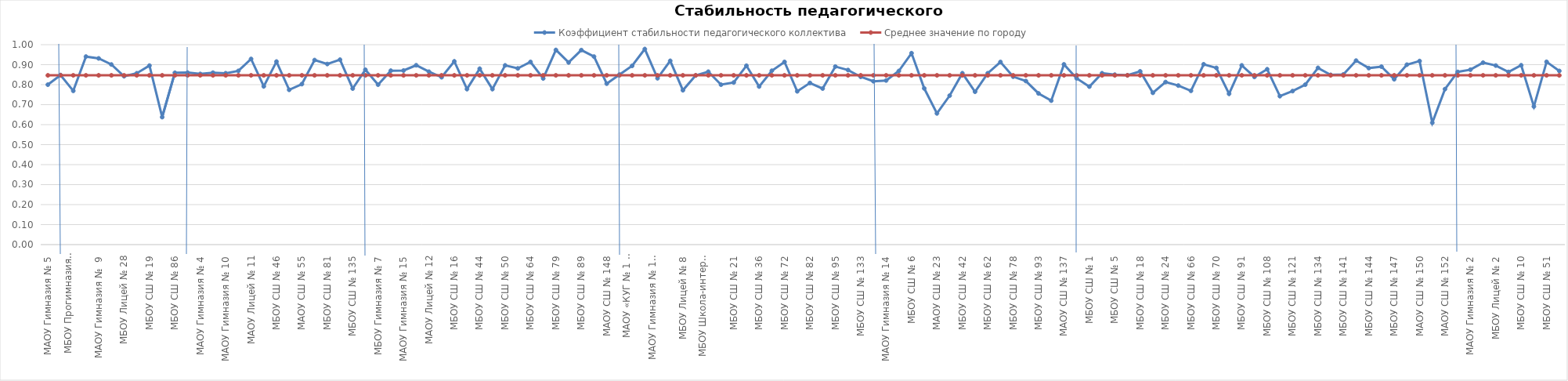
| Category | Коэффициент стабильности педагогического коллектива | Среднее значение по городу |
|---|---|---|
| МАОУ Гимназия № 5 | 0.8 | 0.847 |
| ЖЕЛЕЗНОДОРОЖНЫЙ РАЙОН | 0.848 | 0.847 |
| МБОУ Прогимназия  № 131 | 0.769 | 0.847 |
| МБОУ Гимназия № 8 | 0.94 | 0.847 |
| МАОУ Гимназия №  9 | 0.931 | 0.847 |
| МАОУ Лицей № 7 | 0.901 | 0.847 |
| МБОУ Лицей № 28 | 0.842 | 0.847 |
| МБОУ СШ  № 12 | 0.857 | 0.847 |
| МБОУ СШ № 19 | 0.895 | 0.847 |
| МАОУ СШ № 32 | 0.638 | 0.847 |
| МБОУ СШ № 86 | 0.86 | 0.847 |
| КИРОВСКИЙ РАЙОН | 0.86 | 0.847 |
| МАОУ Гимназия № 4 | 0.854 | 0.847 |
| МАОУ Гимназия № 6 | 0.86 | 0.847 |
| МАОУ Гимназия № 10 | 0.857 | 0.847 |
| МАОУ Лицей № 6 "Перспектива" | 0.869 | 0.847 |
| МАОУ Лицей № 11 | 0.929 | 0.847 |
| МБОУ СШ № 8 "Созидание" | 0.792 | 0.847 |
| МБОУ СШ № 46 | 0.915 | 0.847 |
| МБОУ СШ № 49 | 0.774 | 0.847 |
| МАОУ СШ № 55 | 0.803 | 0.847 |
| МБОУ СШ № 63 | 0.923 | 0.847 |
| МБОУ СШ № 81 | 0.903 | 0.847 |
| МБОУ СШ № 90 | 0.925 | 0.847 |
| МБОУ СШ № 135 | 0.78 | 0.847 |
| ЛЕНИНСКИЙ РАЙОН | 0.875 | 0.847 |
| МБОУ Гимназия № 7 | 0.8 | 0.847 |
| МАОУ Гимназия № 11 | 0.87 | 0.847 |
| МАОУ Гимназия № 15 | 0.871 | 0.847 |
| МБОУ Лицей № 3 | 0.897 | 0.847 |
| МАОУ Лицей № 12 | 0.865 | 0.847 |
| МБОУ СШ № 13 | 0.837 | 0.847 |
| МБОУ СШ № 16 | 0.917 | 0.847 |
| МБОУ СШ № 31 | 0.778 | 0.847 |
| МБОУ СШ № 44 | 0.88 | 0.847 |
| МБОУ СШ № 47 | 0.778 | 0.847 |
| МБОУ СШ № 50 | 0.897 | 0.847 |
| МБОУ СШ № 53 | 0.881 | 0.847 |
| МБОУ СШ № 64 | 0.914 | 0.847 |
| МБОУ СШ № 65 | 0.831 | 0.847 |
| МБОУ СШ № 79 | 0.974 | 0.847 |
| МБОУ СШ № 88 | 0.911 | 0.847 |
| МБОУ СШ № 89 | 0.973 | 0.847 |
| МБОУ СШ № 94 | 0.94 | 0.847 |
| МАОУ СШ № 148 | 0.805 | 0.847 |
| ОКТЯБРЬСКИЙ РАЙОН | 0.85 | 0.847 |
| МАОУ «КУГ № 1 – Универс» | 0.894 | 0.847 |
| МАОУ Гимназия № 3 | 0.978 | 0.847 |
| МАОУ Гимназия № 13 "Академ" | 0.832 | 0.847 |
| МАОУ Лицей № 1 | 0.919 | 0.847 |
| МБОУ Лицей № 8 | 0.772 | 0.847 |
| МБОУ Лицей № 10 | 0.846 | 0.847 |
| МБОУ Школа-интернат № 1 | 0.865 | 0.847 |
| МБОУ СШ № 3 | 0.8 | 0.847 |
| МБОУ СШ № 21 | 0.811 | 0.847 |
| МБОУ СШ № 30 | 0.895 | 0.847 |
| МБОУ СШ № 36 | 0.791 | 0.847 |
| МБОУ СШ № 39 | 0.87 | 0.847 |
| МБОУ СШ № 72 | 0.914 | 0.847 |
| МБОУ СШ № 73 | 0.767 | 0.847 |
| МБОУ СШ № 82 | 0.809 | 0.847 |
| МБОУ СШ № 84 | 0.78 | 0.847 |
| МБОУ СШ № 95 | 0.891 | 0.847 |
| МБОУ СШ № 99 | 0.873 | 0.847 |
| МБОУ СШ № 133 | 0.839 | 0.847 |
| СВЕРДЛОВСКИЙ РАЙОН | 0.817 | 0.847 |
| МАОУ Гимназия № 14 | 0.821 | 0.847 |
| МАОУ Лицей № 9 "Лидер" | 0.868 | 0.847 |
| МБОУ СШ № 6 | 0.957 | 0.847 |
| МБОУ СШ № 17 | 0.781 | 0.847 |
| МАОУ СШ № 23 | 0.656 | 0.847 |
| МБОУ СШ № 34 | 0.745 | 0.847 |
| МБОУ СШ № 42 | 0.857 | 0.847 |
| МБОУ СШ № 45 | 0.765 | 0.847 |
| МБОУ СШ № 62 | 0.857 | 0.847 |
| МБОУ СШ № 76 | 0.914 | 0.847 |
| МБОУ СШ № 78 | 0.84 | 0.847 |
| МБОУ СШ № 92 | 0.818 | 0.847 |
| МБОУ СШ № 93 | 0.756 | 0.847 |
| МБОУ СШ № 97 | 0.72 | 0.847 |
| МАОУ СШ № 137 | 0.901 | 0.847 |
| СОВЕТСКИЙ РАЙОН | 0.832 | 0.847 |
| МБОУ СШ № 1 | 0.79 | 0.847 |
| МБОУ СШ № 2 | 0.857 | 0.847 |
| МБОУ СШ № 5 | 0.85 | 0.847 |
| МБОУ СШ № 7 | 0.847 | 0.847 |
| МБОУ СШ № 18 | 0.867 | 0.847 |
| МАОУ СШ № 22 | 0.759 | 0.847 |
| МБОУ СШ № 24 | 0.813 | 0.847 |
| МБОУ СШ № 56 | 0.795 | 0.847 |
| МБОУ СШ № 66 | 0.769 | 0.847 |
| МБОУ СШ № 69 | 0.902 | 0.847 |
| МБОУ СШ № 70 | 0.884 | 0.847 |
| МБОУ СШ № 85 | 0.754 | 0.847 |
| МБОУ СШ № 91 | 0.897 | 0.847 |
| МБОУ СШ № 98 | 0.839 | 0.847 |
| МБОУ СШ № 108 | 0.877 | 0.847 |
| МБОУ СШ № 115 | 0.742 | 0.847 |
| МБОУ СШ № 121 | 0.768 | 0.847 |
| МБОУ СШ № 129 | 0.8 | 0.847 |
| МБОУ СШ № 134 | 0.884 | 0.847 |
| МБОУ СШ № 139 | 0.849 | 0.847 |
| МБОУ СШ № 141 | 0.851 | 0.847 |
| МАОУ СШ № 143 | 0.92 | 0.847 |
| МБОУ СШ № 144 | 0.883 | 0.847 |
| МАОУ СШ № 145 | 0.89 | 0.847 |
| МБОУ СШ № 147 | 0.827 | 0.847 |
| МАОУ СШ № 149 | 0.9 | 0.847 |
| МАОУ СШ № 150 | 0.918 | 0.847 |
| МАОУ СШ № 151 | 0.609 | 0.847 |
| МАОУ СШ № 152 | 0.778 | 0.847 |
| ЦЕНТРАЛЬНЫЙ РАЙОН | 0.864 | 0.847 |
| МАОУ Гимназия № 2 | 0.875 | 0.847 |
| МБОУ  Гимназия № 16 | 0.91 | 0.847 |
| МБОУ Лицей № 2 | 0.896 | 0.847 |
| МБОУ СШ № 4 | 0.864 | 0.847 |
| МБОУ СШ № 10 | 0.897 | 0.847 |
| МБОУ СШ № 27 | 0.691 | 0.847 |
| МБОУ СШ № 51 | 0.914 | 0.847 |
| МАОУ СШ № 153 | 0.869 | 0.847 |